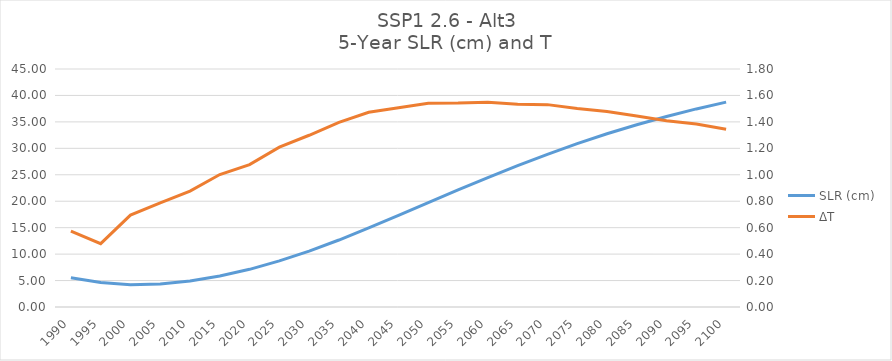
| Category | SLR (cm) |
|---|---|
| 1990.0 | 5.549 |
| 1995.0 | 4.625 |
| 2000.0 | 4.219 |
| 2005.0 | 4.353 |
| 2010.0 | 4.915 |
| 2015.0 | 5.869 |
| 2020.0 | 7.122 |
| 2025.0 | 8.712 |
| 2030.0 | 10.562 |
| 2035.0 | 12.663 |
| 2040.0 | 14.952 |
| 2045.0 | 17.323 |
| 2050.0 | 19.749 |
| 2055.0 | 22.135 |
| 2060.0 | 24.478 |
| 2065.0 | 26.716 |
| 2070.0 | 28.87 |
| 2075.0 | 30.876 |
| 2080.0 | 32.748 |
| 2085.0 | 34.464 |
| 2090.0 | 36.022 |
| 2095.0 | 37.453 |
| 2100.0 | 38.731 |